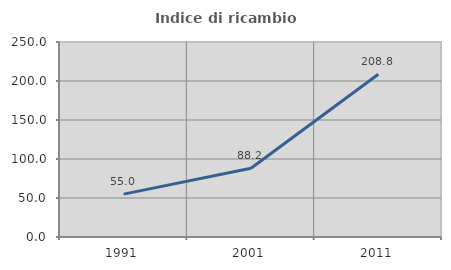
| Category | Indice di ricambio occupazionale  |
|---|---|
| 1991.0 | 54.962 |
| 2001.0 | 88.235 |
| 2011.0 | 208.75 |